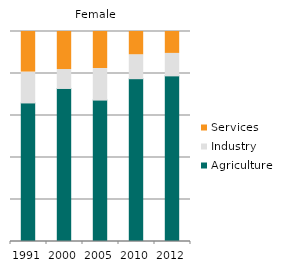
| Category | Agriculture | Industry | Services |
|---|---|---|---|
| 1991.0 | 65.977 | 14.708 | 19.315 |
| 2000.0 | 72.872 | 9.013 | 18.116 |
| 2005.0 | 67.343 | 15.023 | 17.634 |
| 2010.0 | 77.524 | 11.4 | 11.076 |
| 2012.0 | 78.873 | 10.697 | 10.43 |